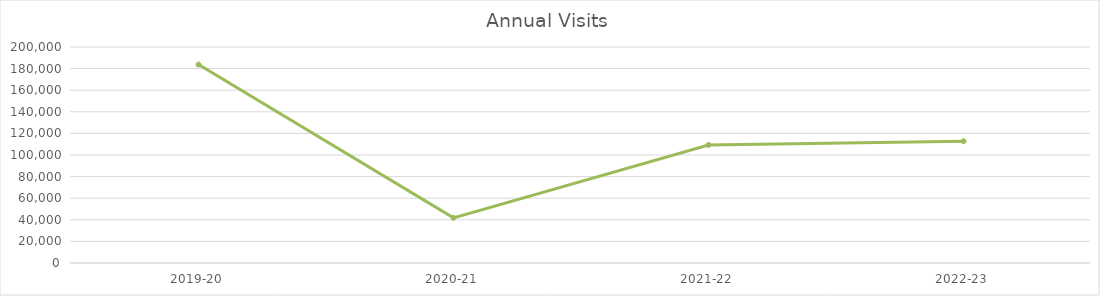
| Category | Series 0 |
|---|---|
| 2019-20 | 183752 |
| 2020-21 | 41816 |
| 2021-22 | 109287 |
| 2022-23 | 112731 |